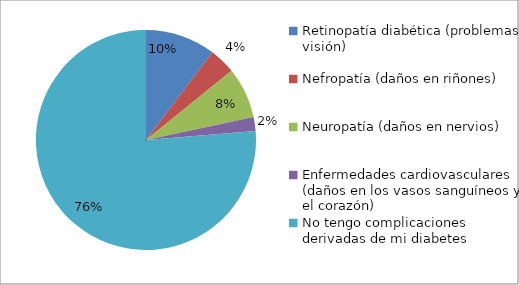
| Category | Series 0 | Series 1 | Series 2 |
|---|---|---|---|
| Retinopatía diabética (problemas visión) |  |  | 40 |
| Nefropatía (daños en riñones) |  |  | 15 |
| Neuropatía (daños en nervios) |  |  | 29 |
| Enfermedades cardiovasculares (daños en los vasos sanguíneos y el corazón) |  |  | 8 |
| No tengo complicaciones derivadas de mi diabetes |  |  | 296 |